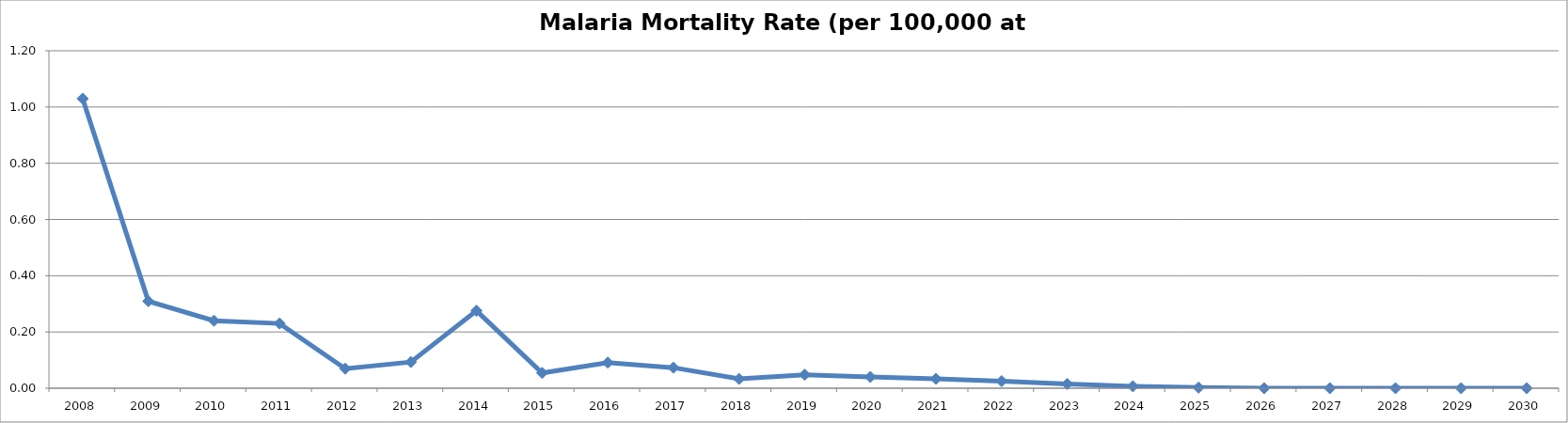
| Category | Malaria Mortality Rate (per 100,000 at risk) |
|---|---|
| 2008.0 | 1.03 |
| 2009.0 | 0.31 |
| 2010.0 | 0.24 |
| 2011.0 | 0.23 |
| 2012.0 | 0.069 |
| 2013.0 | 0.093 |
| 2014.0 | 0.275 |
| 2015.0 | 0.054 |
| 2016.0 | 0.091 |
| 2017.0 | 0.073 |
| 2018.0 | 0.033 |
| 2019.0 | 0.048 |
| 2020.0 | 0.04 |
| 2021.0 | 0.034 |
| 2022.0 | 0.025 |
| 2023.0 | 0.015 |
| 2024.0 | 0.007 |
| 2025.0 | 0.002 |
| 2026.0 | 0 |
| 2027.0 | 0 |
| 2028.0 | 0 |
| 2029.0 | 0 |
| 2030.0 | 0 |